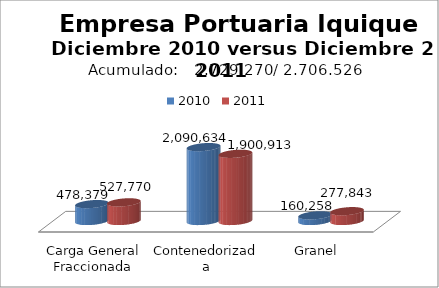
| Category | 2010 | 2011 |
|---|---|---|
| Carga General Fraccionada | 478378.55 | 527770.37 |
| Contenedorizada | 2090633.51 | 1900912.95 |
| Granel | 160257.65 | 277842.58 |